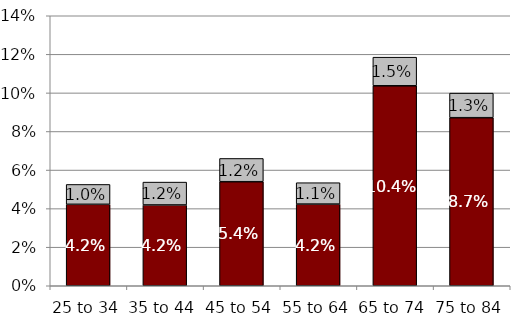
| Category | Share with payee guardian | Share with non-payee guardian |
|---|---|---|
| 25 to 34 | 0.042 | 0.01 |
| 35 to 44 | 0.042 | 0.012 |
| 45 to 54 | 0.054 | 0.012 |
| 55 to 64 | 0.042 | 0.011 |
| 65 to 74 | 0.104 | 0.015 |
| 75 to 84 | 0.087 | 0.013 |